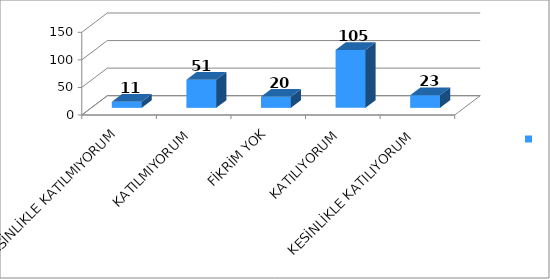
| Category | Series 0 |
|---|---|
| KESİNLİKLE KATILMIYORUM | 11 |
| KATILMIYORUM | 51 |
| FİKRİM YOK | 20 |
| KATILIYORUM | 105 |
| KESİNLİKLE KATILIYORUM | 23 |